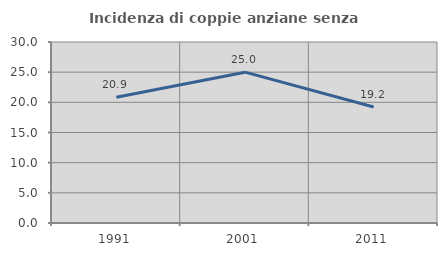
| Category | Incidenza di coppie anziane senza figli  |
|---|---|
| 1991.0 | 20.856 |
| 2001.0 | 25 |
| 2011.0 | 19.231 |